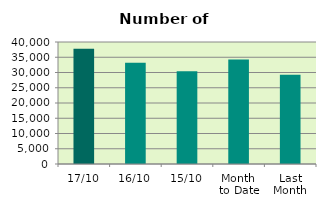
| Category | Series 0 |
|---|---|
| 17/10 | 37802 |
| 16/10 | 33214 |
| 15/10 | 30384 |
| Month 
to Date | 34222 |
| Last
Month | 29250.6 |